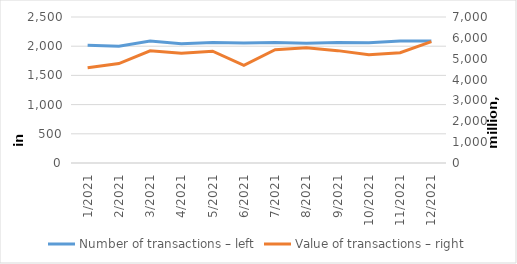
| Category | Number of transactions – left |
|---|---|
| 1/2021 | 2017651 |
| 2/2021 | 1999480 |
| 3/2021 | 2090122 |
| 4/2021 | 2044053 |
| 5/2021 | 2062167 |
| 6/2021 | 2054069 |
| 7/2021 | 2065147 |
| 8/2021 | 2052495 |
| 9/2021 | 2062074 |
| 10/2021 | 2057133 |
| 11/2021 | 2087971 |
| 12/2021 | 2088273 |